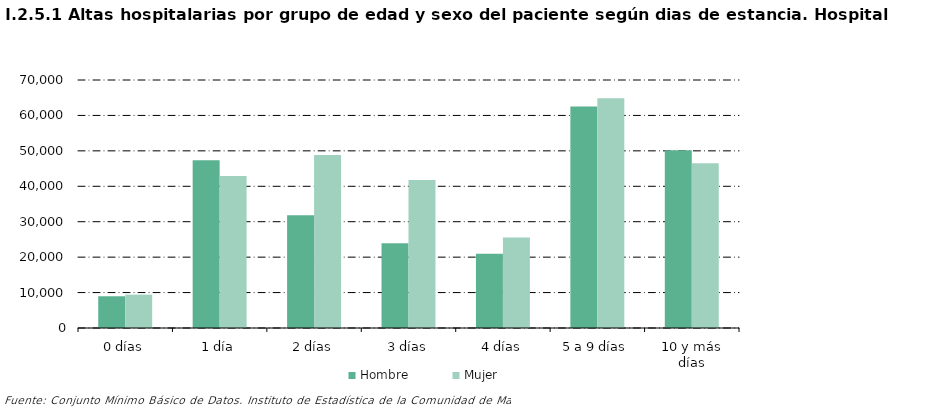
| Category |     Hombre |     Mujer |
|---|---|---|
| 0 | 8957 | 9416 |
| 1 | 47338 | 42931 |
| 2 | 31849 | 48819 |
| 3 | 23954 | 41777 |
| 4 | 20955 | 25544 |
| 5 | 62534 | 64822 |
| 6 | 50145 | 46504 |